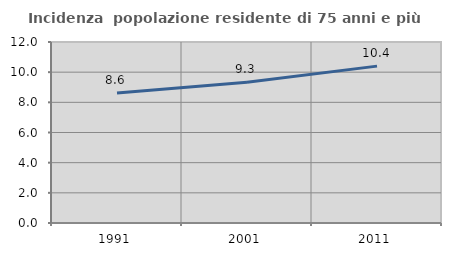
| Category | Incidenza  popolazione residente di 75 anni e più |
|---|---|
| 1991.0 | 8.622 |
| 2001.0 | 9.332 |
| 2011.0 | 10.401 |